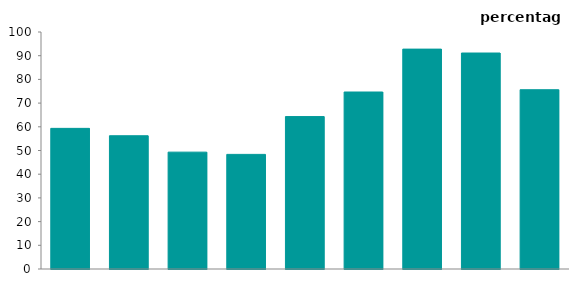
| Category | 2019-20 |
|---|---|
| North 
East | 59.337 |
| North 
West | 56.23 |
| Yorkshire 
and 
Humber | 49.309 |
| East 
Midlands | 48.358 |
| West 
Midlands | 64.317 |
| East of 
England | 74.681 |
| London | 92.78 |
| South 
East | 91.129 |
| South 
West | 75.64 |